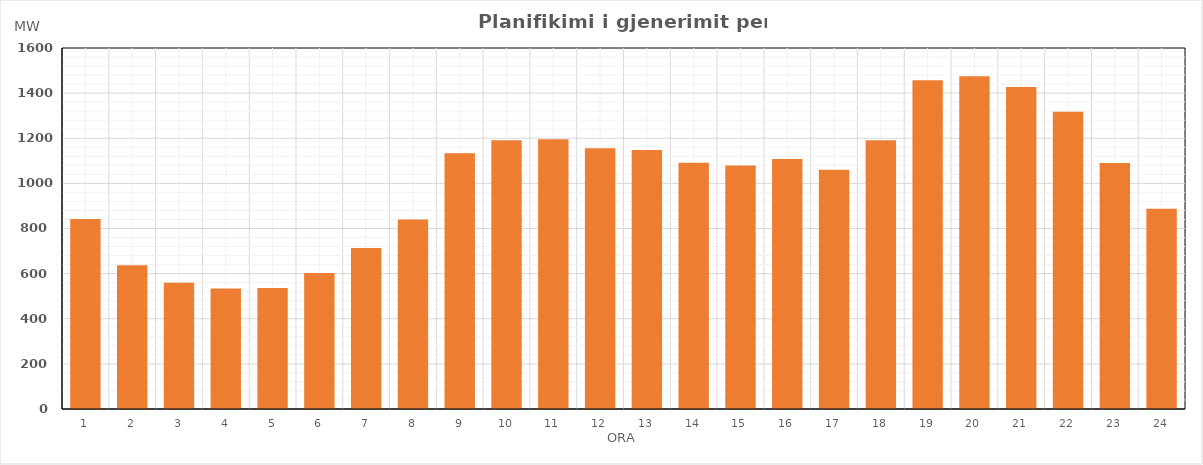
| Category | Max (MW) |
|---|---|
| 0 | 842.392 |
| 1 | 636.904 |
| 2 | 559.057 |
| 3 | 533.906 |
| 4 | 536.3 |
| 5 | 602.94 |
| 6 | 713.421 |
| 7 | 840.092 |
| 8 | 1133.565 |
| 9 | 1190.865 |
| 10 | 1195.966 |
| 11 | 1155.576 |
| 12 | 1148.441 |
| 13 | 1090.873 |
| 14 | 1079.372 |
| 15 | 1107.691 |
| 16 | 1060.212 |
| 17 | 1191.3 |
| 18 | 1457.205 |
| 19 | 1474.714 |
| 20 | 1427.536 |
| 21 | 1317.95 |
| 22 | 1089.772 |
| 23 | 887.839 |